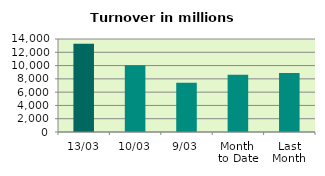
| Category | Series 0 |
|---|---|
| 13/03 | 13273.481 |
| 10/03 | 10036.067 |
| 9/03 | 7409.56 |
| Month 
to Date | 8625.477 |
| Last
Month | 8884.685 |